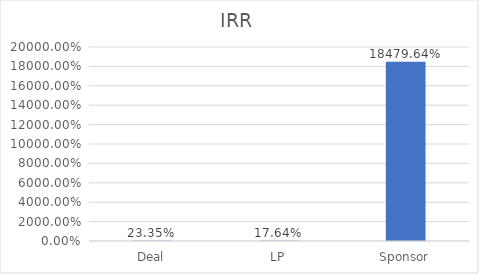
| Category | Series 0 |
|---|---|
| Deal | 0.233 |
| LP | 0.176 |
| Sponsor | 184.796 |